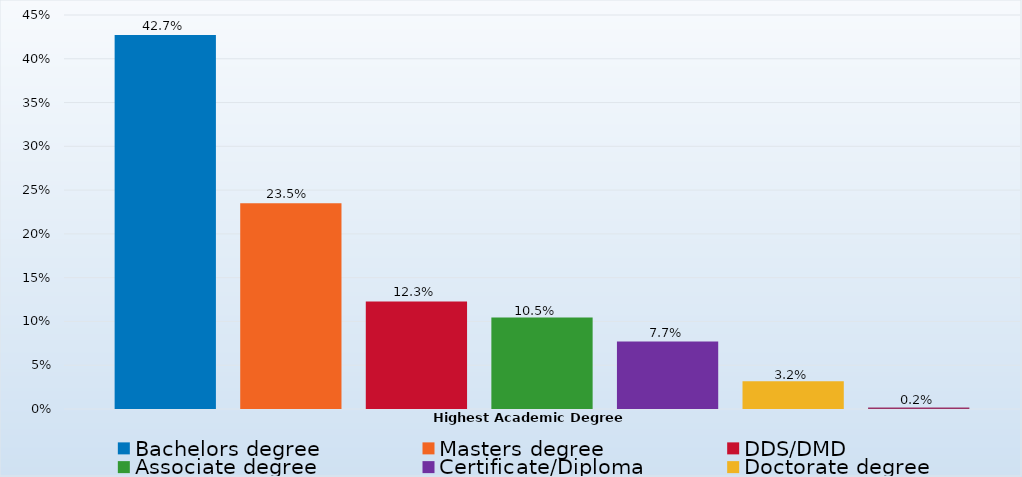
| Category | Bachelors degree | Masters degree | DDS/DMD | Associate degree | Certificate/Diploma | Doctorate degree | Other |
|---|---|---|---|---|---|---|---|
| Percent | 0.427 | 0.235 | 0.123 | 0.105 | 0.077 | 0.032 | 0.002 |